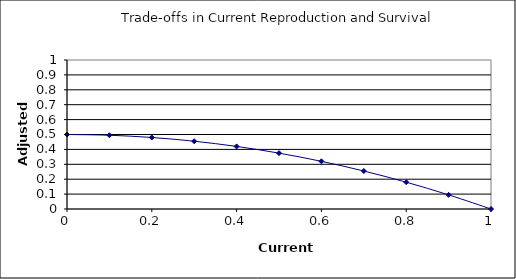
| Category | Adjusted survival |
|---|---|
| 0.0 | 0.5 |
| 0.1 | 0.495 |
| 0.2 | 0.48 |
| 0.30000000000000004 | 0.455 |
| 0.4 | 0.42 |
| 0.5 | 0.375 |
| 0.6 | 0.32 |
| 0.7 | 0.255 |
| 0.7999999999999999 | 0.18 |
| 0.8999999999999999 | 0.095 |
| 0.9999999999999999 | 0 |